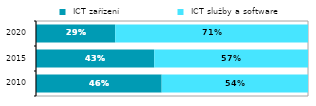
| Category |  ICT zařízení |  ICT služby a software |
|---|---|---|
| 2010.0 | 0.462 | 0.538 |
| 2015.0 | 0.435 | 0.565 |
| 2020.0 | 0.291 | 0.709 |